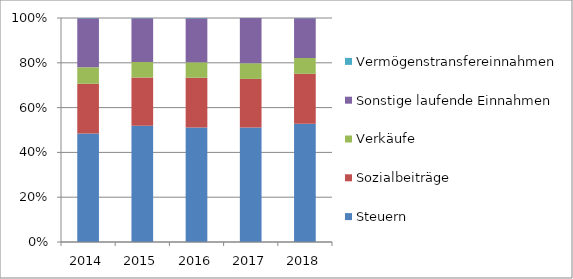
| Category | Steuern | Sozialbeiträge | Verkäufe | Sonstige laufende Einnahmen | Vermögenstransfereinnahmen |
|---|---|---|---|---|---|
| 2014.0 | 0.484 | 0.222 | 0.074 | 0.219 | 0.002 |
| 2015.0 | 0.519 | 0.216 | 0.069 | 0.195 | 0.001 |
| 2016.0 | 0.512 | 0.222 | 0.069 | 0.196 | 0.002 |
| 2017.0 | 0.511 | 0.217 | 0.07 | 0.202 | 0 |
| 2018.0 | 0.527 | 0.223 | 0.07 | 0.178 | 0.001 |